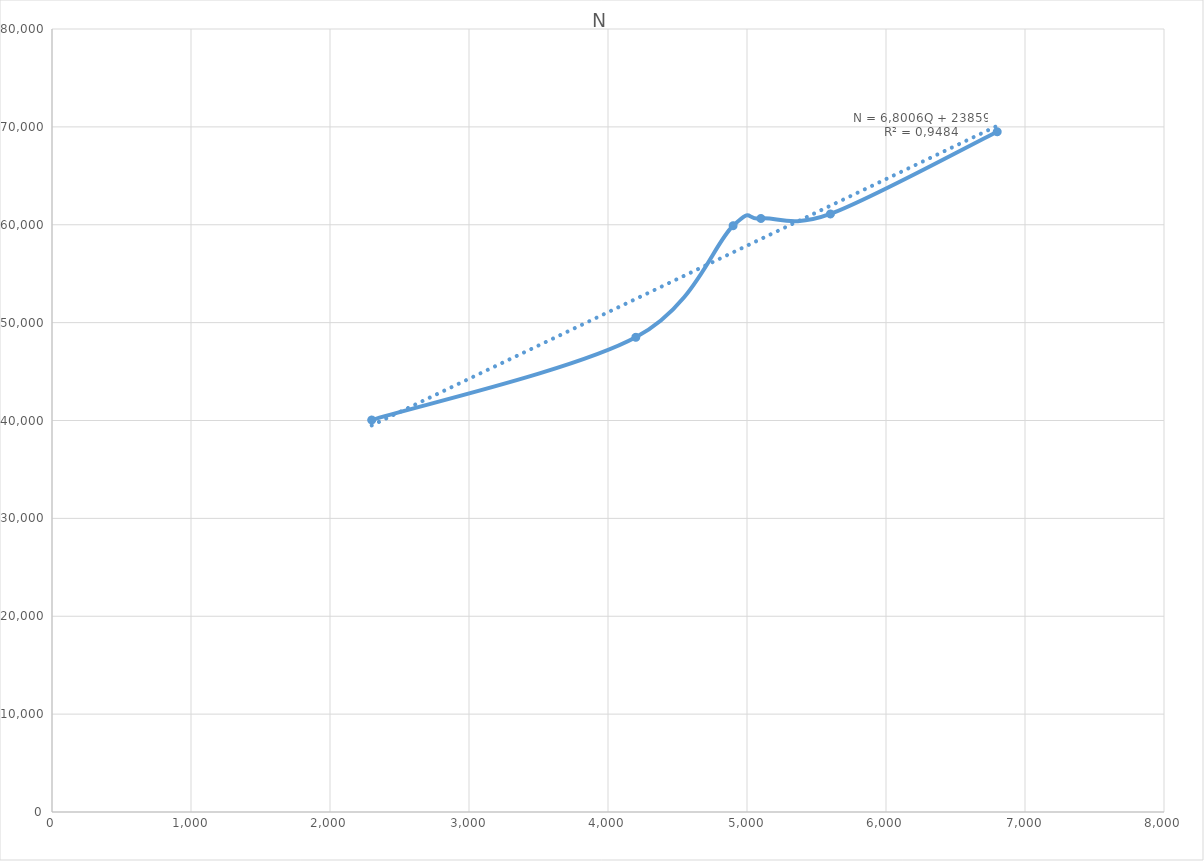
| Category | N |
|---|---|
| 2300.0 | 40050 |
| 4200.0 | 48500 |
| 4900.0 | 59900 |
| 5100.0 | 60640 |
| 5600.0 | 61100 |
| 6800.0 | 69500 |